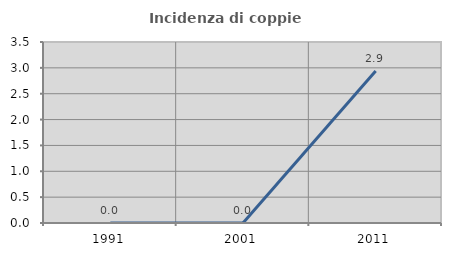
| Category | Incidenza di coppie miste |
|---|---|
| 1991.0 | 0 |
| 2001.0 | 0 |
| 2011.0 | 2.941 |